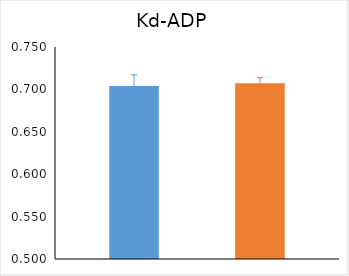
| Category | Series 0 | Series 1 | Series 2 |
|---|---|---|---|
| 0 | 0.704 |  | 0.707 |